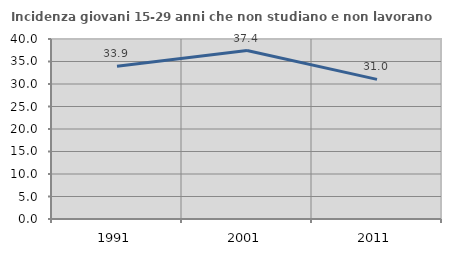
| Category | Incidenza giovani 15-29 anni che non studiano e non lavorano  |
|---|---|
| 1991.0 | 33.921 |
| 2001.0 | 37.432 |
| 2011.0 | 31.022 |